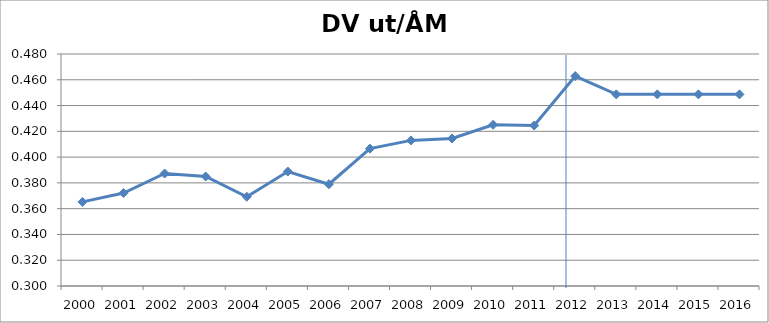
| Category | DV ut/ÅM ut |
|---|---|
| 2000.0 | 0.365 |
| 2001.0 | 0.372 |
| 2002.0 | 0.387 |
| 2003.0 | 0.385 |
| 2004.0 | 0.369 |
| 2005.0 | 0.389 |
| 2006.0 | 0.379 |
| 2007.0 | 0.407 |
| 2008.0 | 0.413 |
| 2009.0 | 0.414 |
| 2010.0 | 0.425 |
| 2011.0 | 0.425 |
| 2012.0 | 0.463 |
| 2013.0 | 0.449 |
| 2014.0 | 0.449 |
| 2015.0 | 0.449 |
| 2016.0 | 0.449 |